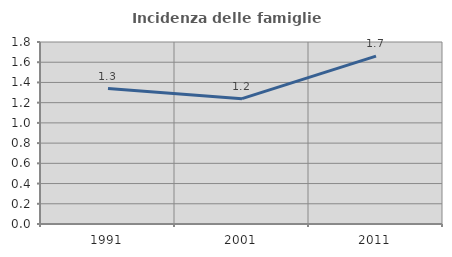
| Category | Incidenza delle famiglie numerose |
|---|---|
| 1991.0 | 1.339 |
| 2001.0 | 1.24 |
| 2011.0 | 1.66 |